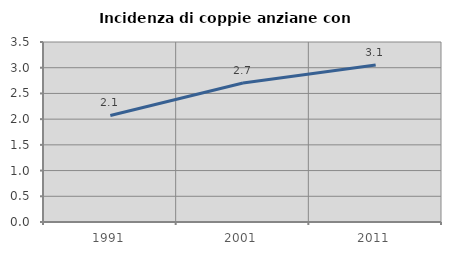
| Category | Incidenza di coppie anziane con figli |
|---|---|
| 1991.0 | 2.072 |
| 2001.0 | 2.702 |
| 2011.0 | 3.054 |